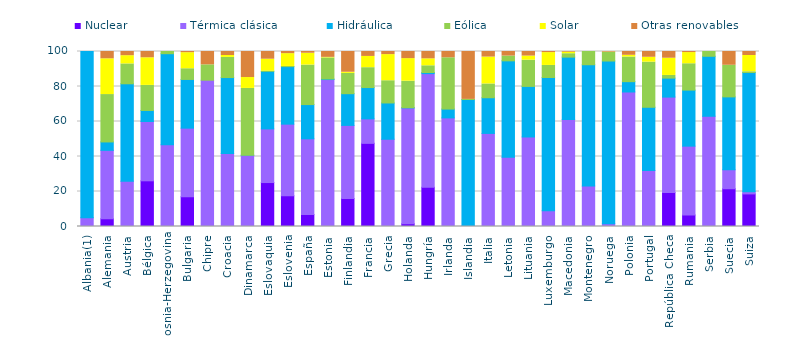
| Category | Nuclear | Térmica clásica | Hidráulica | Eólica | Solar | Otras renovables |
|---|---|---|---|---|---|---|
| Albania(1) | 0 | 5.021 | 94.979 | 0 | 0 | 0 |
| Alemania | 4.425 | 39.09 | 4.808 | 27.077 | 20.424 | 4.174 |
| Austria | 0 | 25.869 | 55.68 | 11.36 | 4.694 | 2.396 |
| Bélgica | 26.108 | 33.876 | 6.321 | 14.322 | 15.796 | 3.577 |
| Bosnia-Herzegovina | 0 | 46.691 | 52.058 | 1.251 | 0 | 0 |
| Bulgaria | 17.024 | 39.178 | 27.83 | 6.111 | 9.184 | 0.672 |
| Chipre | 0 | 83.607 | 0 | 8.768 | 0 | 7.625 |
| Croacia | 0 | 41.763 | 43.357 | 11.507 | 1.076 | 2.297 |
| Dinamarca | 0 | 40.711 | 0.041 | 38.139 | 6.229 | 14.879 |
| Eslovaquia | 25.117 | 30.645 | 32.923 | 0.039 | 6.875 | 4.402 |
| Eslovenia | 17.584 | 40.901 | 32.887 | 0.083 | 7.332 | 1.213 |
| España | 6.837 | 43.265 | 19.576 | 22.583 | 6.742 | 0.997 |
| Estonia | 0 | 83.972 | 0.328 | 12.029 | 0.314 | 3.356 |
| Finlandia | 16.033 | 41.74 | 18.123 | 11.589 | 0.651 | 11.865 |
| Francia | 47.513 | 13.99 | 17.903 | 11.352 | 6.417 | 2.825 |
| Grecia | 0 | 49.855 | 20.737 | 12.7 | 14.935 | 1.773 |
| Holanda | 1.592 | 66.166 | 0.124 | 15.152 | 12.895 | 4.071 |
| Hungría | 22.41 | 64.94 | 0.661 | 3.835 | 3.965 | 4.189 |
| Irlanda | 0 | 62.06 | 5.043 | 29.305 | 0 | 3.592 |
| Islandia | 0 | 0.395 | 72.172 | 0.066 | 0 | 27.367 |
| Italia | 0 | 53.191 | 20.39 | 7.874 | 15.366 | 3.178 |
| Letonia | 0 | 39.625 | 55.037 | 2.722 | 0 | 2.616 |
| Lituania | 0 | 51.158 | 28.896 | 14.992 | 2.334 | 2.62 |
| Luxemburgo | 0 | 9.002 | 76.147 | 6.881 | 7.339 | 0.631 |
| Macedonia | 0 | 61.094 | 35.695 | 1.943 | 0.898 | 0.37 |
| Montenegro | 0 | 23.109 | 69.328 | 7.563 | 0 | 0 |
| Noruega | 0 | 1.547 | 93.012 | 4.993 | 0.128 | 0.32 |
| Polonia | 0 | 76.864 | 5.906 | 14.063 | 1.001 | 2.167 |
| Portugal | 0 | 32.019 | 36.115 | 25.777 | 2.794 | 3.295 |
| República Checa | 19.404 | 54.544 | 10.85 | 1.518 | 9.841 | 3.842 |
| Rumania | 6.577 | 39.345 | 32.02 | 15.061 | 6.385 | 0.612 |
| Serbia | 0 | 62.997 | 34.277 | 2.726 | 0 | 0 |
| Suecia | 21.585 | 10.81 | 41.671 | 18.054 | 0 | 7.881 |
| Suiza | 18.625 | 1.179 | 68.203 | 0.419 | 9.299 | 2.274 |